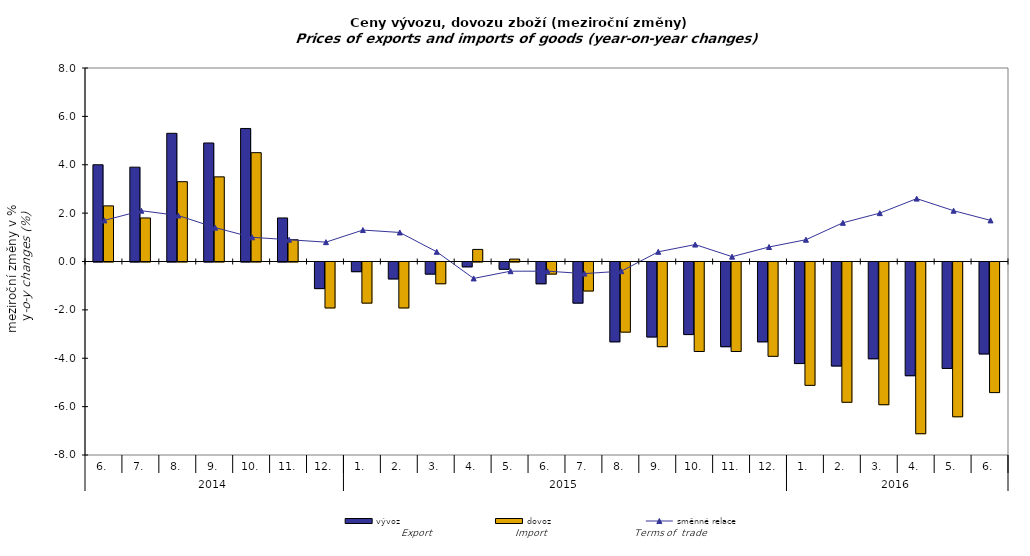
| Category | vývoz | dovoz |
|---|---|---|
| 0 | 4 | 2.3 |
| 1 | 3.9 | 1.8 |
| 2 | 5.3 | 3.3 |
| 3 | 4.9 | 3.5 |
| 4 | 5.5 | 4.5 |
| 5 | 1.8 | 0.9 |
| 6 | -1.1 | -1.9 |
| 7 | -0.4 | -1.7 |
| 8 | -0.7 | -1.9 |
| 9 | -0.5 | -0.9 |
| 10 | -0.2 | 0.5 |
| 11 | -0.3 | 0.1 |
| 12 | -0.9 | -0.5 |
| 13 | -1.7 | -1.2 |
| 14 | -3.3 | -2.9 |
| 15 | -3.1 | -3.5 |
| 16 | -3 | -3.7 |
| 17 | -3.5 | -3.7 |
| 18 | -3.3 | -3.9 |
| 19 | -4.2 | -5.1 |
| 20 | -4.3 | -5.8 |
| 21 | -4 | -5.9 |
| 22 | -4.7 | -7.1 |
| 23 | -4.4 | -6.4 |
| 24 | -3.8 | -5.4 |